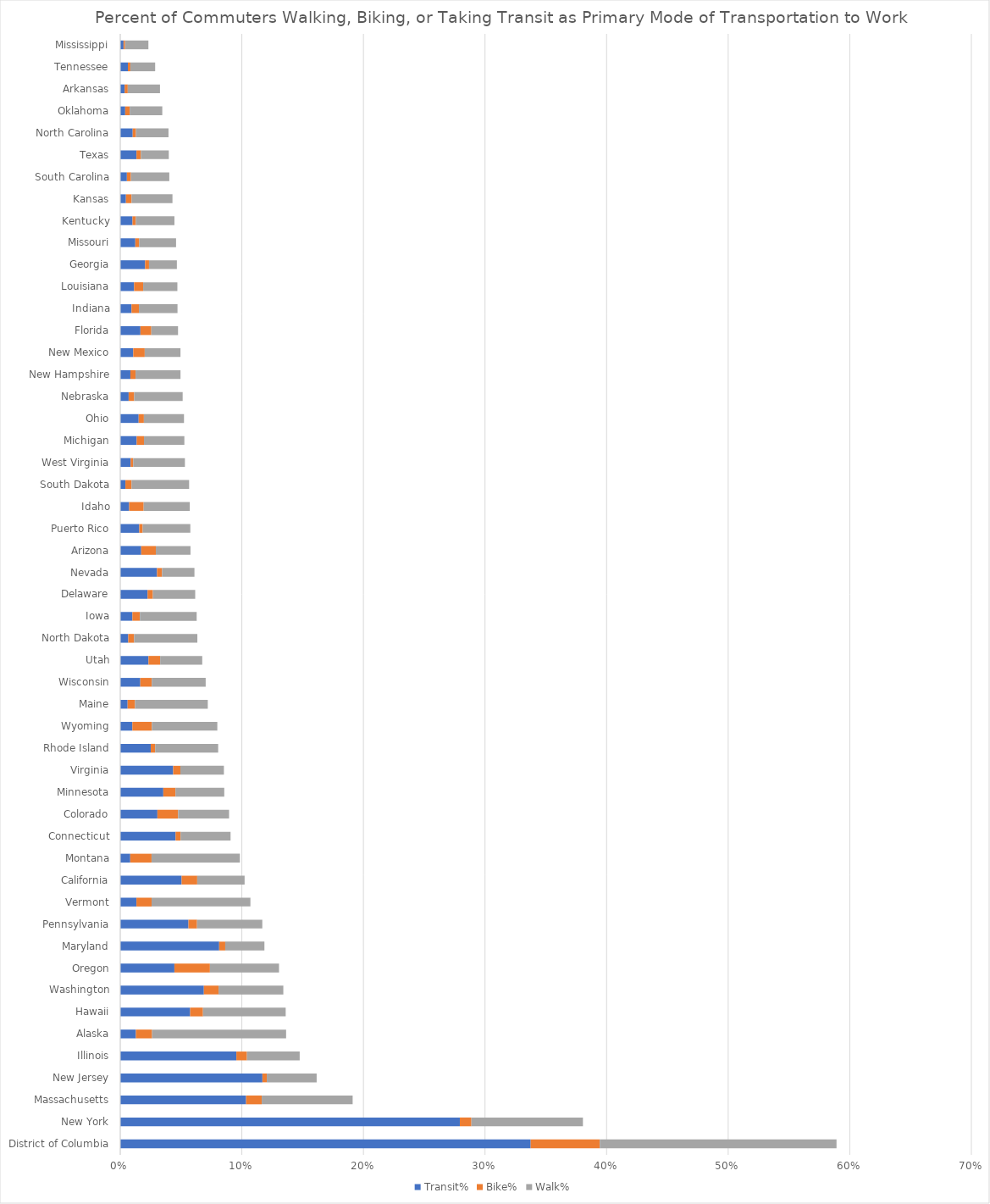
| Category | Transit% | Bike% | Walk% |
|---|---|---|---|
| District of Columbia | 0.338 | 0.057 | 0.195 |
| New York | 0.279 | 0.01 | 0.092 |
| Massachusetts | 0.103 | 0.013 | 0.075 |
| New Jersey | 0.117 | 0.004 | 0.041 |
| Illinois | 0.096 | 0.009 | 0.043 |
| Alaska | 0.013 | 0.013 | 0.11 |
| Hawaii | 0.057 | 0.011 | 0.068 |
| Washington | 0.069 | 0.012 | 0.053 |
| Oregon | 0.045 | 0.029 | 0.057 |
| Maryland | 0.081 | 0.005 | 0.032 |
| Pennsylvania | 0.056 | 0.007 | 0.054 |
| Vermont | 0.013 | 0.012 | 0.081 |
| California | 0.05 | 0.013 | 0.039 |
| Montana | 0.008 | 0.018 | 0.073 |
| Connecticut | 0.046 | 0.004 | 0.041 |
| Colorado | 0.031 | 0.017 | 0.042 |
| Minnesota | 0.035 | 0.01 | 0.04 |
| Virginia | 0.044 | 0.006 | 0.036 |
| Rhode Island | 0.025 | 0.004 | 0.052 |
| Wyoming | 0.01 | 0.016 | 0.054 |
| Maine | 0.006 | 0.006 | 0.06 |
| Wisconsin | 0.016 | 0.009 | 0.044 |
| Utah | 0.023 | 0.01 | 0.035 |
| North Dakota | 0.007 | 0.005 | 0.052 |
| Iowa | 0.01 | 0.006 | 0.047 |
| Delaware | 0.022 | 0.004 | 0.035 |
| Nevada | 0.03 | 0.004 | 0.027 |
| Arizona | 0.017 | 0.012 | 0.028 |
| Puerto Rico | 0.016 | 0.003 | 0.039 |
| Idaho | 0.007 | 0.012 | 0.038 |
| South Dakota | 0.004 | 0.005 | 0.047 |
| West Virginia | 0.009 | 0.002 | 0.043 |
| Michigan | 0.014 | 0.006 | 0.033 |
| Ohio | 0.015 | 0.004 | 0.033 |
| Nebraska | 0.007 | 0.005 | 0.04 |
| New Hampshire | 0.008 | 0.004 | 0.037 |
| New Mexico | 0.011 | 0.009 | 0.029 |
| Florida | 0.017 | 0.009 | 0.022 |
| Indiana | 0.009 | 0.006 | 0.032 |
| Louisiana | 0.011 | 0.007 | 0.028 |
| Georgia | 0.02 | 0.003 | 0.023 |
| Missouri | 0.012 | 0.003 | 0.03 |
| Kentucky | 0.01 | 0.003 | 0.032 |
| Kansas | 0.005 | 0.005 | 0.034 |
| South Carolina | 0.005 | 0.003 | 0.032 |
| Texas | 0.013 | 0.004 | 0.023 |
| North Carolina | 0.01 | 0.003 | 0.027 |
| Oklahoma | 0.004 | 0.004 | 0.027 |
| Arkansas | 0.004 | 0.003 | 0.027 |
| Tennessee | 0.006 | 0.002 | 0.02 |
| Mississippi | 0.003 | 0.001 | 0.019 |